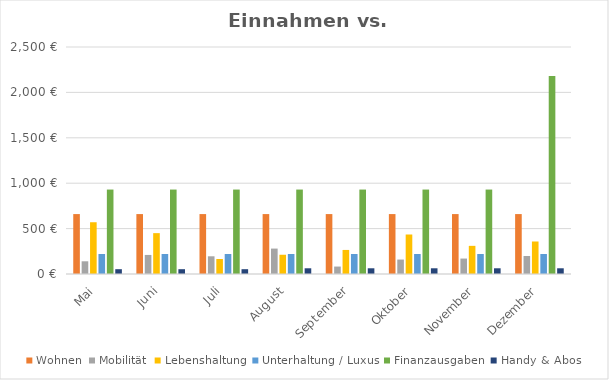
| Category | Wohnen | Mobilität | Lebenshaltung | Unterhaltung / Luxus | Finanzausgaben | Handy & Abos |
|---|---|---|---|---|---|---|
| Mai | 659.98 | 140 | 570 | 220 | 930 | 52.98 |
| Juni | 659.98 | 210 | 450 | 220 | 930 | 52.98 |
| Juli | 659.98 | 195 | 165 | 220 | 930 | 52.98 |
| August | 659.98 | 280 | 212 | 220 | 930 | 62.98 |
| September | 659.98 | 82 | 265 | 220 | 930 | 62.98 |
| Oktober | 659.98 | 159 | 435 | 220 | 930 | 62.98 |
| November | 659.98 | 170 | 310 | 220 | 930 | 62.98 |
| Dezember | 659.98 | 198 | 358 | 220 | 2180 | 62.98 |